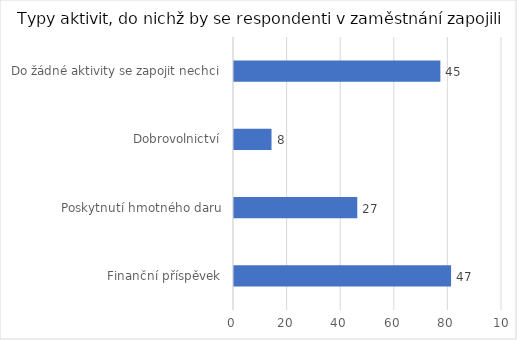
| Category | Počet respondentů |
|---|---|
| Finanční příspěvek | 81 |
| Poskytnutí hmotného daru | 46 |
| Dobrovolnictví | 14 |
| Do žádné aktivity se zapojit nechci | 77 |